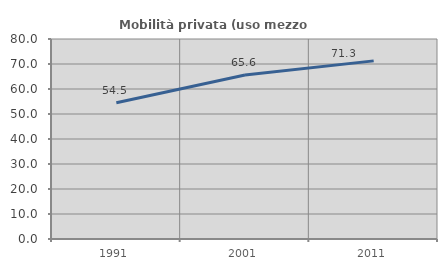
| Category | Mobilità privata (uso mezzo privato) |
|---|---|
| 1991.0 | 54.516 |
| 2001.0 | 65.569 |
| 2011.0 | 71.25 |